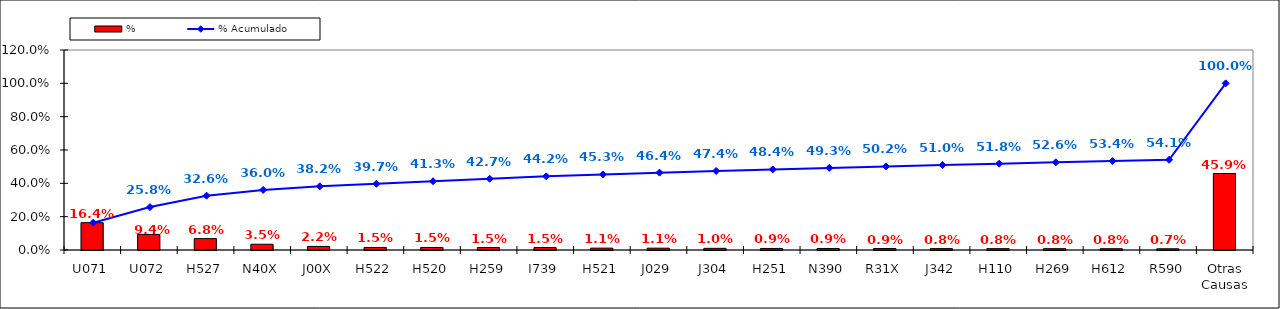
| Category | % |
|---|---|
| U071 | 0.164 |
| U072 | 0.094 |
| H527 | 0.068 |
| N40X | 0.035 |
| J00X | 0.022 |
| H522 | 0.015 |
| H520 | 0.015 |
| H259 | 0.015 |
| I739 | 0.015 |
| H521 | 0.011 |
| J029 | 0.011 |
| J304 | 0.01 |
| H251 | 0.009 |
| N390 | 0.009 |
| R31X | 0.009 |
| J342 | 0.008 |
| H110 | 0.008 |
| H269 | 0.008 |
| H612 | 0.008 |
| R590 | 0.007 |
| Otras Causas | 0.459 |